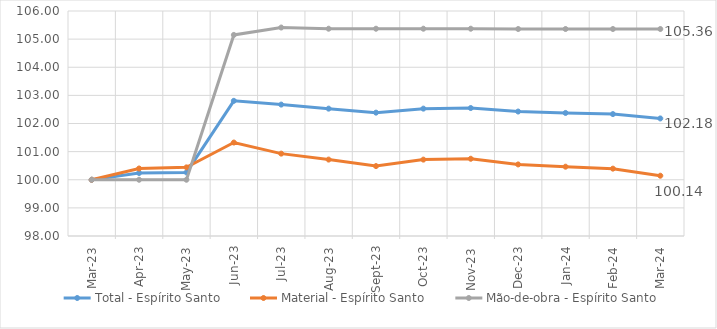
| Category | Total - Espírito Santo | Material - Espírito Santo | Mão-de-obra - Espírito Santo |
|---|---|---|---|
| 2023-03-01 | 100 | 100 | 100 |
| 2023-04-01 | 100.24 | 100.4 | 100 |
| 2023-05-01 | 100.26 | 100.44 | 100 |
| 2023-06-01 | 102.806 | 101.323 | 105.15 |
| 2023-07-01 | 102.672 | 100.929 | 105.412 |
| 2023-08-01 | 102.528 | 100.717 | 105.37 |
| 2023-09-01 | 102.386 | 100.486 | 105.37 |
| 2023-10-01 | 102.528 | 100.716 | 105.37 |
| 2023-11-01 | 102.549 | 100.747 | 105.37 |
| 2023-12-01 | 102.426 | 100.545 | 105.36 |
| 2024-01-01 | 102.375 | 100.464 | 105.36 |
| 2024-02-01 | 102.334 | 100.395 | 105.36 |
| 2024-03-01 | 102.18 | 100.143 | 105.36 |